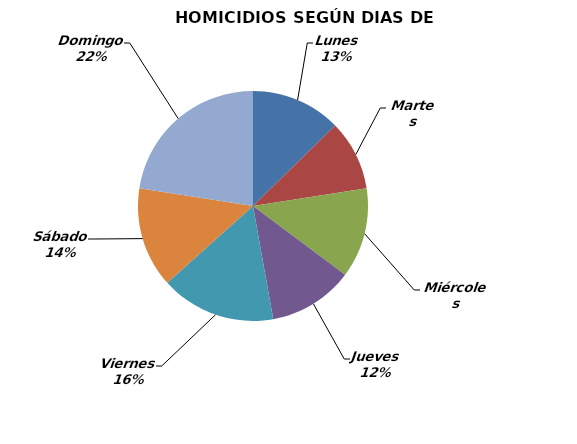
| Category | Series 0 |
|---|---|
| Lunes | 18 |
| Martes | 14 |
| Miércoles | 18 |
| Jueves | 17 |
| Viernes | 23 |
| Sábado | 20 |
| Domingo | 32 |